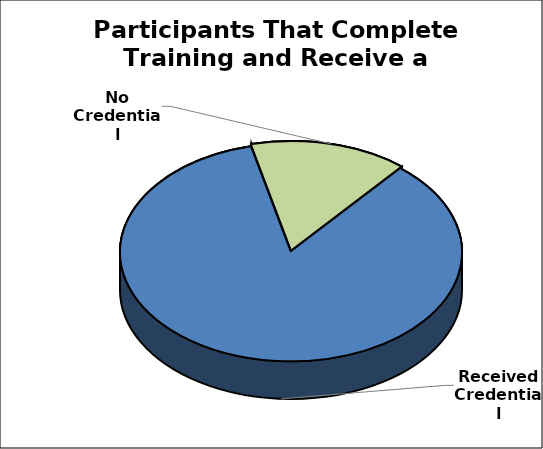
| Category | Series 0 |
|---|---|
| Received Credential | 103 |
| No Credential | 18 |